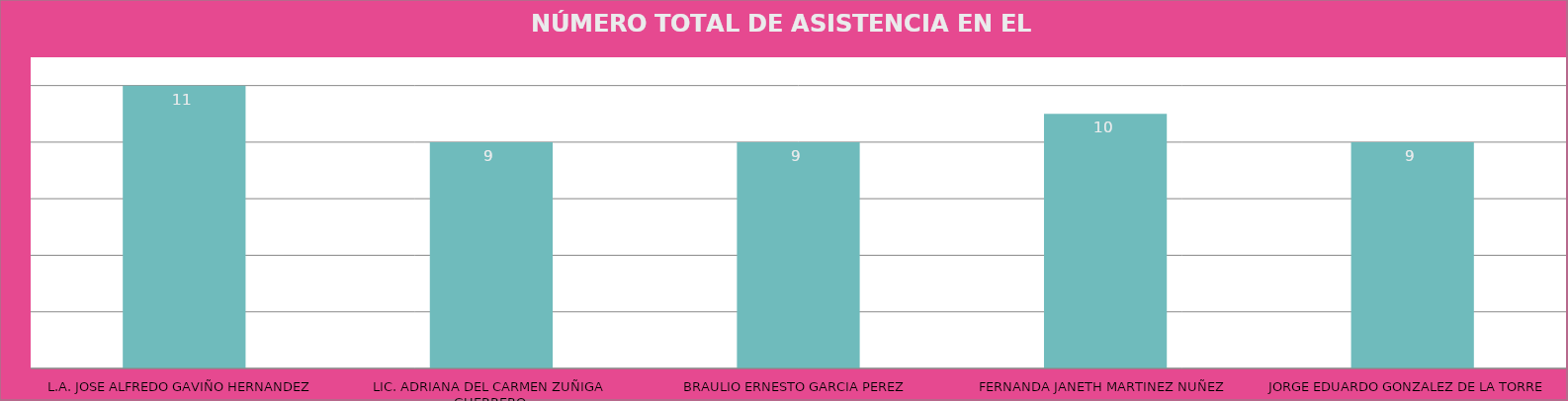
| Category | L.A. JOSE ALFREDO GAVIÑO HERNANDEZ |
|---|---|
| L.A. JOSE ALFREDO GAVIÑO HERNANDEZ | 11 |
| LIC. ADRIANA DEL CARMEN ZUÑIGA GUERRERO | 9 |
| BRAULIO ERNESTO GARCIA PEREZ | 9 |
| FERNANDA JANETH MARTINEZ NUÑEZ | 10 |
| JORGE EDUARDO GONZALEZ DE LA TORRE | 9 |